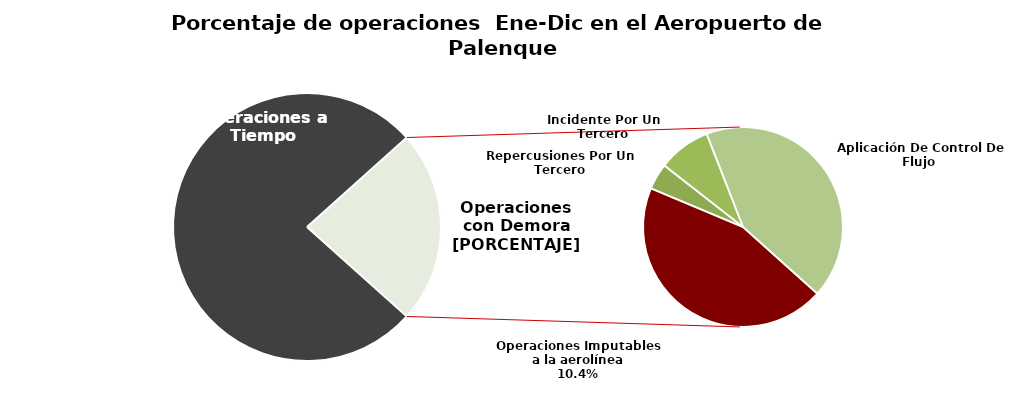
| Category | Series 0 |
|---|---|
| Operaciones a Tiempo | 155 |
| Operaciones Imputables a la aerolínea | 21 |
| Repercusiones Por Un Tercero | 2 |
| Incidente Por Un Tercero | 4 |
| Aplicación De Control De Flujo  | 20 |